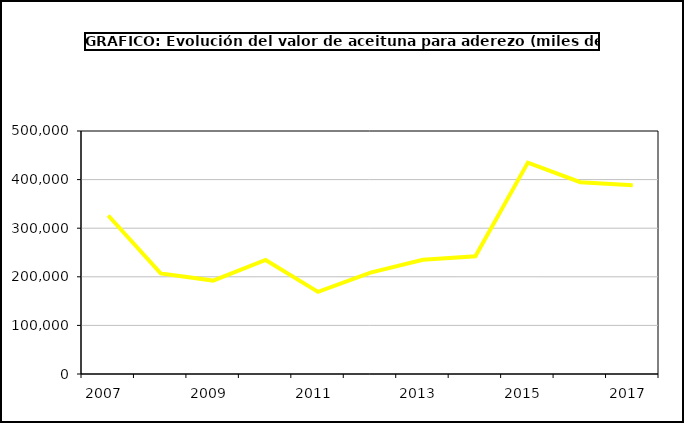
| Category | producción |
|---|---|
| 2007.0 | 326124.5 |
| 2008.0 | 207000.08 |
| 2009.0 | 192222.48 |
| 2010.0 | 234593.447 |
| 2011.0 | 168933.753 |
| 2012.0 | 208668.687 |
| 2013.0 | 235213.576 |
| 2014.0 | 242272.525 |
| 2015.0 | 434946 |
| 2016.0 | 394686 |
| 2017.0 | 388313.865 |